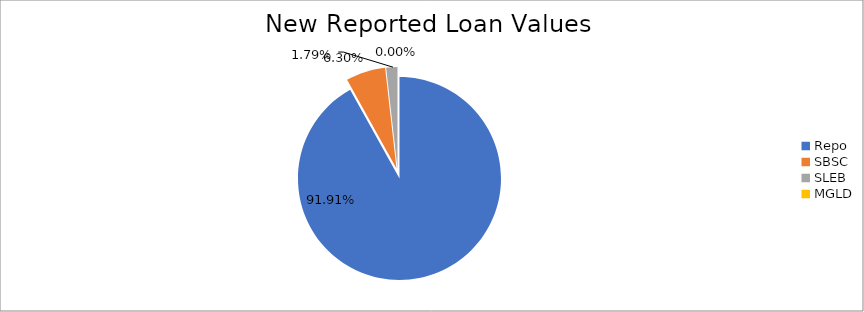
| Category | Series 0 |
|---|---|
| Repo | 12300121.223 |
| SBSC | 842978.016 |
| SLEB | 239125.152 |
| MGLD | 423.377 |